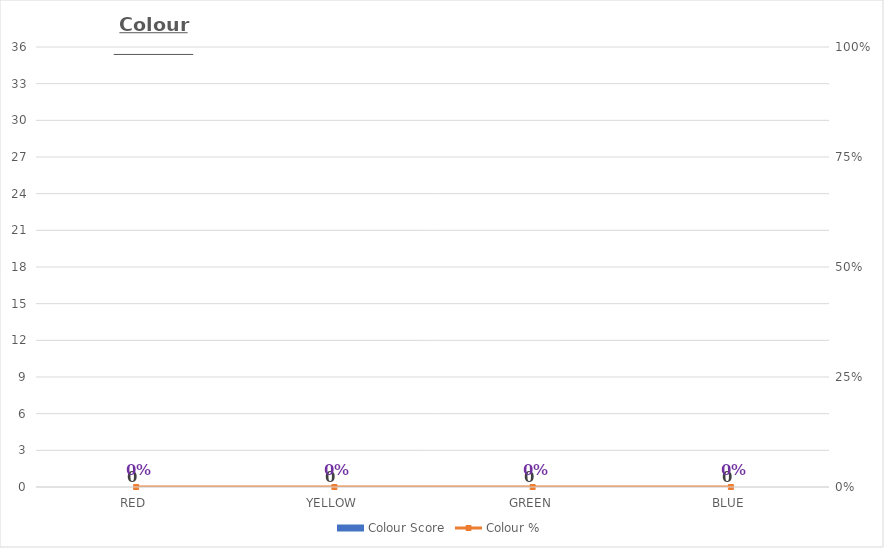
| Category | Colour Score |
|---|---|
| RED | 0 |
| YELLOW | 0 |
| GREEN | 0 |
| BLUE | 0 |